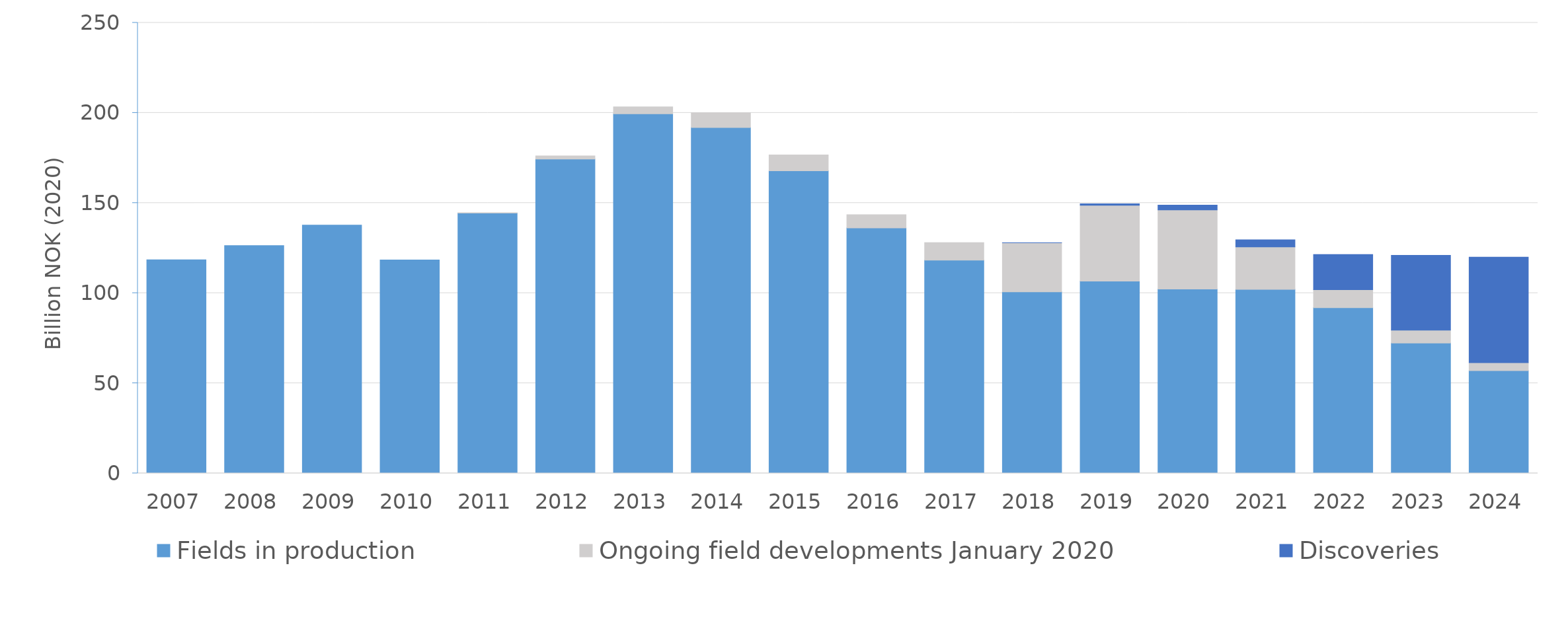
| Category | Fields in production | Ongoing field developments January 2020 | Discoveries |
|---|---|---|---|
| 2007.0 | 118.456 | 0 | 0 |
| 2008.0 | 126.372 | 0 | 0 |
| 2009.0 | 137.763 | 0 | 0 |
| 2010.0 | 118.437 | 0 | 0 |
| 2011.0 | 144.396 | 0.249 | 0 |
| 2012.0 | 174.423 | 1.758 | 0 |
| 2013.0 | 199.537 | 3.843 | 0 |
| 2014.0 | 191.937 | 8.083 | 0 |
| 2015.0 | 167.904 | 8.786 | 0 |
| 2016.0 | 136.137 | 7.415 | 0 |
| 2017.0 | 118.293 | 9.695 | 0 |
| 2018.0 | 100.705 | 27.201 | 0.011 |
| 2019.0 | 106.681 | 42.085 | 0.776 |
| 2020.0 | 102.231 | 43.97 | 2.615 |
| 2021.0 | 102.069 | 23.579 | 3.93 |
| 2022.0 | 91.899 | 10.032 | 19.53 |
| 2023.0 | 72.286 | 7.177 | 41.475 |
| 2024.0 | 57.031 | 4.374 | 58.577 |